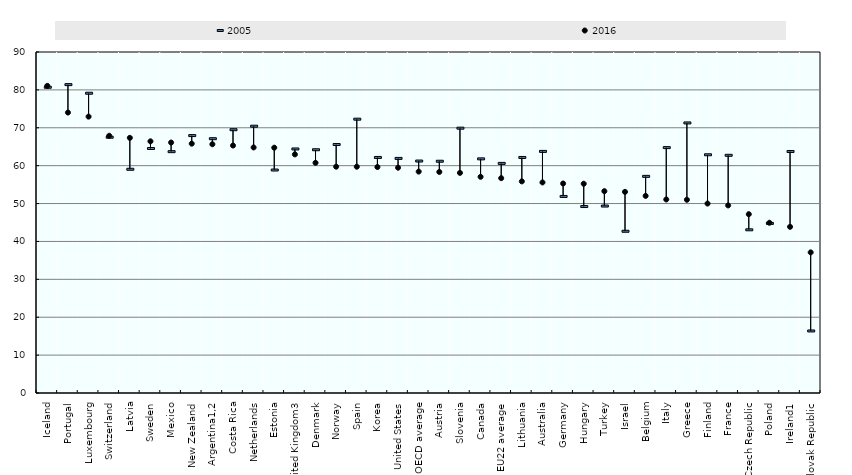
| Category | 2005 | 2016 |
|---|---|---|
| Iceland | 80.694 | 81.067 |
| Portugal | 81.391 | 74.024 |
| Luxembourg | 79.118 | 72.944 |
| Switzerland | 67.509 | 67.888 |
| Latvia | 59.049 | 67.343 |
| Sweden | 64.527 | 66.427 |
| Mexico | 63.694 | 66.109 |
| New Zealand | 67.94 | 65.81 |
| Argentina1,2 | 67.117 | 65.653 |
| Costa Rica | 69.489 | 65.313 |
| Netherlands | 70.413 | 64.809 |
| Estonia | 58.849 | 64.747 |
| United Kingdom3 | 64.409 | 62.984 |
| Denmark | 64.202 | 60.756 |
| Norway | 65.58 | 59.733 |
| Spain | 72.269 | 59.725 |
| Korea | 62.168 | 59.64 |
| United States | 61.917 | 59.464 |
| OECD average | 61.22 | 58.432 |
| Austria | 61.168 | 58.34 |
| Slovenia | 69.898 | 58.096 |
| Canada | 61.795 | 57.059 |
| EU22 average | 60.598 | 56.701 |
| Lithuania | 62.164 | 55.853 |
| Australia | 63.766 | 55.578 |
| Germany | 51.876 | 55.292 |
| Hungary | 49.215 | 55.228 |
| Turkey | 49.342 | 53.267 |
| Israel | 42.69 | 53.086 |
| Belgium | 57.176 | 52.021 |
| Italy | 64.767 | 51.076 |
| Greece | 71.28 | 50.998 |
| Finland | 62.874 | 50 |
| France | 62.734 | 49.511 |
| Czech Republic | 43.072 | 47.193 |
| Poland | 44.759 | 44.937 |
| Ireland1 | 63.741 | 43.858 |
| Slovak Republic | 16.373 | 37.118 |